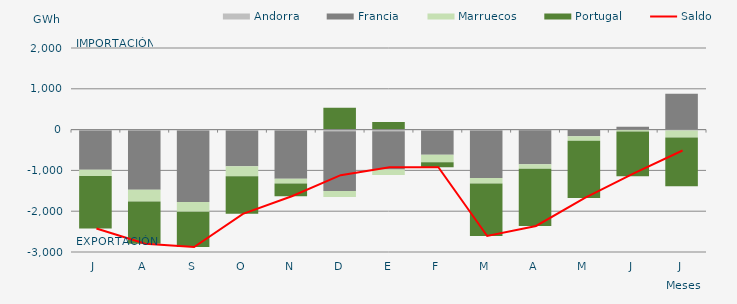
| Category | Andorra | Francia | Marruecos | Portugal |
|---|---|---|---|---|
| J | -22.256 | -963.789 | -152.863 | -1283.78 |
| A | -20.355 | -1451.936 | -291.598 | -1034.215 |
| S | -19.779 | -1752.3 | -243.405 | -861.179 |
| O | -20.359 | -877.448 | -247.178 | -920.502 |
| N | -20.176 | -1184.993 | -114.159 | -314.568 |
| D | -39.88 | -1462.427 | -149.967 | 535.045 |
| E | -42.454 | -936.901 | -131.692 | 188.334 |
| F | -21.206 | -592.499 | -187.112 | -122.026 |
| M | -23.108 | -1163.333 | -133.704 | -1286.701 |
| A | -14.627 | -836.505 | -105.478 | -1404.431 |
| M | -10.909 | -149.423 | -115.706 | -1398.852 |
| J | -2.08 | 70.4 | -42.701 | -1096.73 |
| J | -19.231 | 877.054 | -174.716 | -1194.709 |